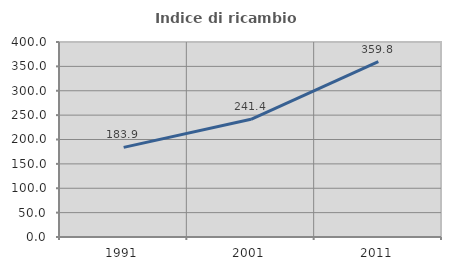
| Category | Indice di ricambio occupazionale  |
|---|---|
| 1991.0 | 183.878 |
| 2001.0 | 241.365 |
| 2011.0 | 359.777 |